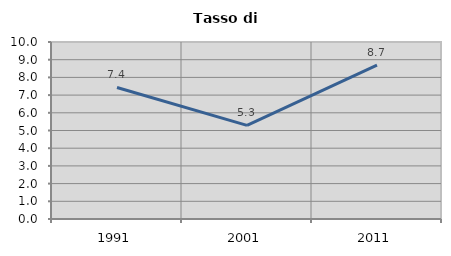
| Category | Tasso di disoccupazione   |
|---|---|
| 1991.0 | 7.431 |
| 2001.0 | 5.287 |
| 2011.0 | 8.696 |